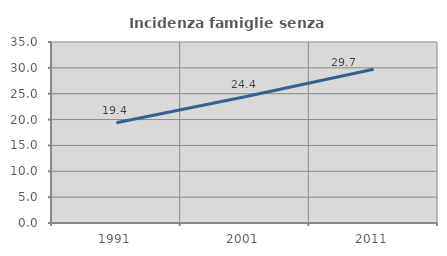
| Category | Incidenza famiglie senza nuclei |
|---|---|
| 1991.0 | 19.396 |
| 2001.0 | 24.405 |
| 2011.0 | 29.73 |